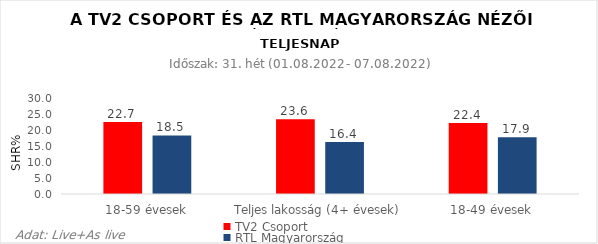
| Category | TV2 Csoport | RTL Magyarország |
|---|---|---|
| 18-59 évesek | 22.7 | 18.5 |
| Teljes lakosság (4+ évesek) | 23.6 | 16.4 |
| 18-49 évesek | 22.4 | 17.9 |